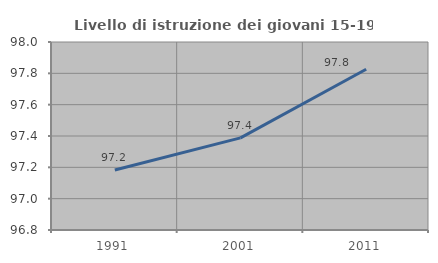
| Category | Livello di istruzione dei giovani 15-19 anni |
|---|---|
| 1991.0 | 97.183 |
| 2001.0 | 97.388 |
| 2011.0 | 97.826 |